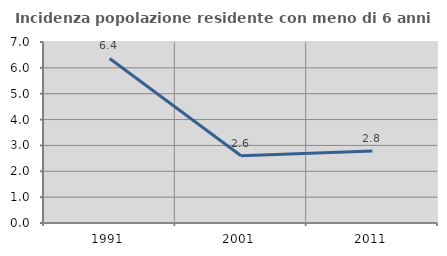
| Category | Incidenza popolazione residente con meno di 6 anni |
|---|---|
| 1991.0 | 6.365 |
| 2001.0 | 2.599 |
| 2011.0 | 2.786 |